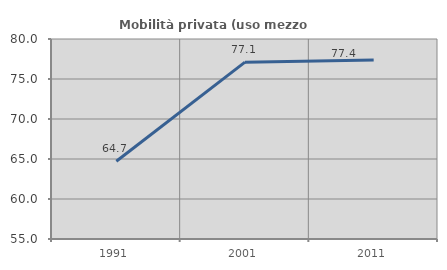
| Category | Mobilità privata (uso mezzo privato) |
|---|---|
| 1991.0 | 64.723 |
| 2001.0 | 77.105 |
| 2011.0 | 77.363 |